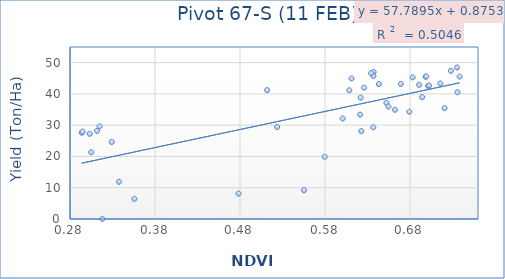
| Category | Series 0 |
|---|---|
| 0.62605 | 42 |
| 0.608538 | 41.17 |
| 0.683135 | 45.3 |
| 0.555281 | 9.2 |
| 0.355808 | 6.43 |
| 0.6692 | 43.2 |
| 0.701385 | 42.57 |
| 0.622669 | 28.1 |
| 0.7353 | 48.45 |
| 0.720723 | 35.45 |
| 0.293727 | 27.6 |
| 0.294823 | 27.95 |
| 0.311826 | 28.18 |
| 0.637204 | 47.01 |
| 0.694286 | 38.97 |
| 0.738299 | 45.55 |
| 0.728121 | 47.39 |
| 0.735887 | 40.53 |
| 0.690743 | 42.88 |
| 0.621276 | 33.37 |
| 0.304989 | 21.32 |
| 0.636826 | 29.32 |
| 0.679164 | 34.3 |
| 0.702436 | 42.66 |
| 0.652259 | 37.14 |
| 0.698394 | 45.5 |
| 0.636987 | 45.73 |
| 0.329103 | 24.63 |
| 0.654666 | 35.94 |
| 0.318012 | 0 |
| 0.611213 | 44.95 |
| 0.643384 | 43.14 |
| 0.662337 | 34.92 |
| 0.57966 | 19.89 |
| 0.634316 | 46.62 |
| 0.621987 | 38.79 |
| 0.699172 | 45.58 |
| 0.600789 | 32.13 |
| 0.303233 | 27.24 |
| 0.337668 | 11.89 |
| 0.511909 | 41.2 |
| 0.314733 | 29.61 |
| 0.715707 | 43.35 |
| 0.523699 | 29.42 |
| 0.478235 | 8.13 |